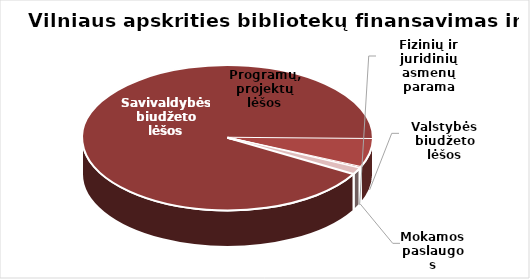
| Category | Series 0 |
|---|---|
| Savivaldybės biudžeto lėšos | 5160675.41 |
| Valstybės biudžeto lėšos | 355648 |
| Mokamos paslaugos | 13186 |
| Fizinių ir juridinių asmenų parama | 6397.01 |
| Programų, projektų lėšos | 78293 |